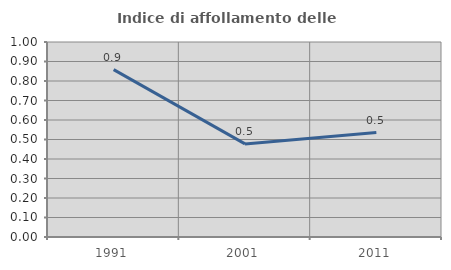
| Category | Indice di affollamento delle abitazioni  |
|---|---|
| 1991.0 | 0.858 |
| 2001.0 | 0.477 |
| 2011.0 | 0.536 |